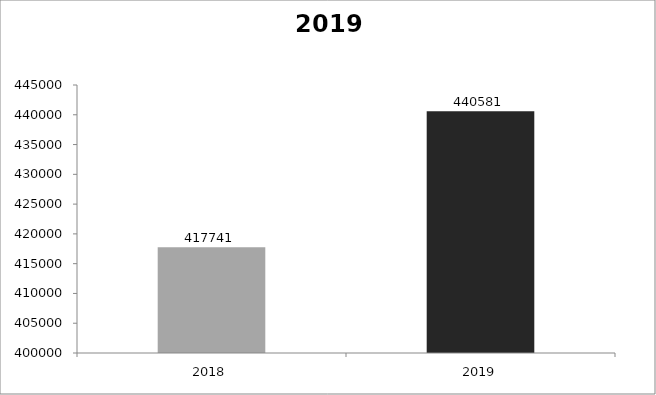
| Category | 2019 |
|---|---|
| 2018.0 | 417741 |
| 2019.0 | 440581 |